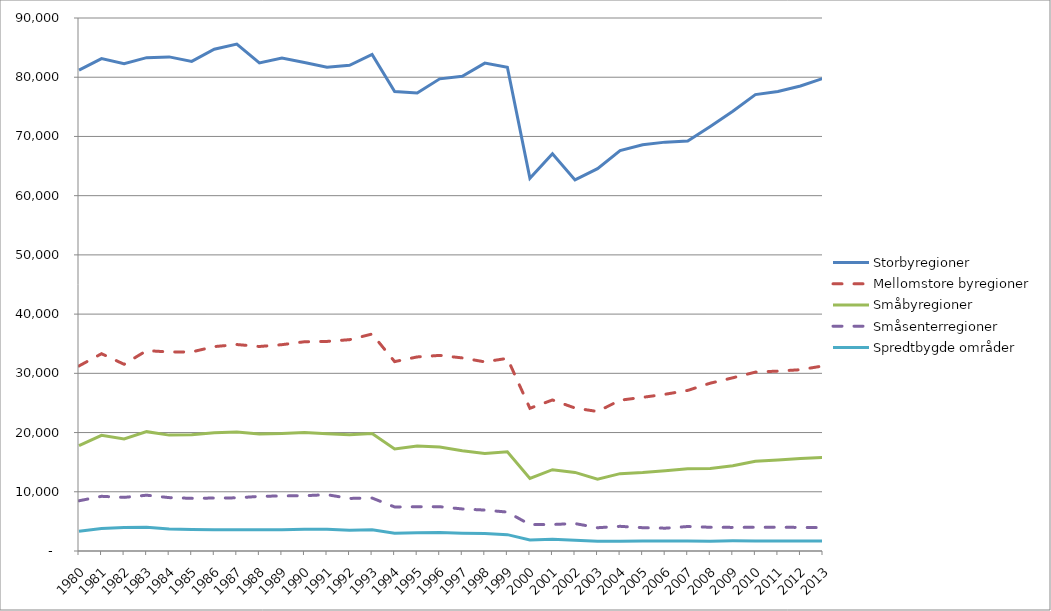
| Category | Storbyregioner | Mellomstore byregioner | Småbyregioner | Småsenterregioner | Spredtbygde områder |
|---|---|---|---|---|---|
| 1980.0 | 81195 | 31250 | 17775 | 8481 | 3354 |
| 1981.0 | 83149 | 33313 | 19531 | 9233 | 3812 |
| 1982.0 | 82290 | 31529 | 18911 | 9053 | 3950 |
| 1983.0 | 83302 | 33838 | 20153 | 9420 | 4018 |
| 1984.0 | 83434 | 33608 | 19568 | 9014 | 3707 |
| 1985.0 | 82668 | 33613 | 19621 | 8894 | 3651 |
| 1986.0 | 84726 | 34512 | 19979 | 8942 | 3580 |
| 1987.0 | 85590 | 34863 | 20077 | 8977 | 3599 |
| 1988.0 | 82410 | 34532 | 19777 | 9222 | 3572 |
| 1989.0 | 83248 | 34839 | 19843 | 9303 | 3591 |
| 1990.0 | 82502 | 35333 | 19997 | 9337 | 3675 |
| 1991.0 | 81682 | 35388 | 19815 | 9508 | 3690 |
| 1992.0 | 82006 | 35684 | 19632 | 8877 | 3502 |
| 1993.0 | 83844 | 36639 | 19832 | 8941 | 3580 |
| 1994.0 | 77571 | 31979 | 17231 | 7437 | 3018 |
| 1995.0 | 77342 | 32770 | 17713 | 7467 | 3096 |
| 1996.0 | 79729 | 33030 | 17561 | 7480 | 3116 |
| 1997.0 | 80177 | 32605 | 16927 | 7102 | 3004 |
| 1998.0 | 82384 | 31934 | 16457 | 6910 | 2946 |
| 1999.0 | 81690 | 32535 | 16747 | 6569 | 2761 |
| 2000.0 | 62946 | 24098 | 12261 | 4461 | 1866 |
| 2001.0 | 67095 | 25502 | 13725 | 4472 | 1984 |
| 2002.0 | 62670 | 24140 | 13274 | 4635 | 1807 |
| 2003.0 | 64568 | 23554 | 12139 | 3930 | 1644 |
| 2004.0 | 67616 | 25464 | 13060 | 4166 | 1657 |
| 2005.0 | 68603 | 25947 | 13241 | 3936 | 1703 |
| 2006.0 | 69040 | 26467 | 13549 | 3854 | 1688 |
| 2007.0 | 69231 | 27116 | 13888 | 4135 | 1708 |
| 2008.0 | 71693 | 28337 | 13950 | 4008 | 1663 |
| 2009.0 | 74265 | 29248 | 14383 | 3986 | 1713 |
| 2010.0 | 77071 | 30205 | 15155 | 4011 | 1685 |
| 2011.0 | 77592 | 30378 | 15370 | 4015 | 1695 |
| 2012.0 | 78517 | 30613 | 15620 | 3978 | 1677 |
| 2013.0 | 79797 | 31249 | 15785 | 3950 | 1676 |